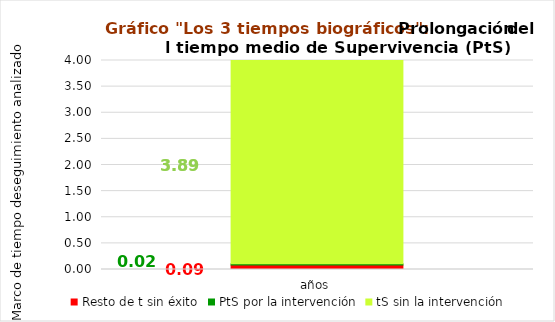
| Category | Resto de t sin éxito | PtS por la intervención | tS sin la intervención |
|---|---|---|---|
| años | 0.085 | 0.024 | 3.891 |